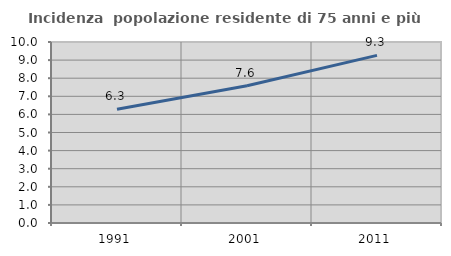
| Category | Incidenza  popolazione residente di 75 anni e più |
|---|---|
| 1991.0 | 6.286 |
| 2001.0 | 7.579 |
| 2011.0 | 9.26 |